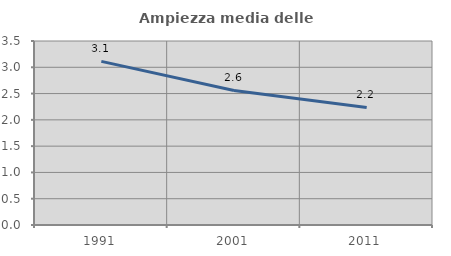
| Category | Ampiezza media delle famiglie |
|---|---|
| 1991.0 | 3.113 |
| 2001.0 | 2.558 |
| 2011.0 | 2.236 |